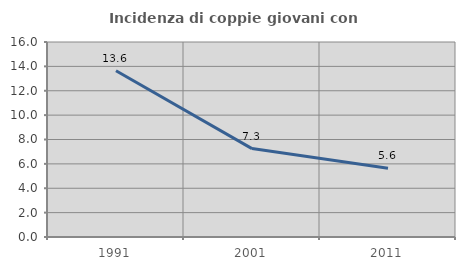
| Category | Incidenza di coppie giovani con figli |
|---|---|
| 1991.0 | 13.641 |
| 2001.0 | 7.253 |
| 2011.0 | 5.641 |